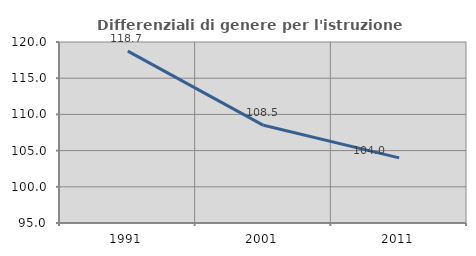
| Category | Differenziali di genere per l'istruzione superiore |
|---|---|
| 1991.0 | 118.739 |
| 2001.0 | 108.492 |
| 2011.0 | 103.991 |